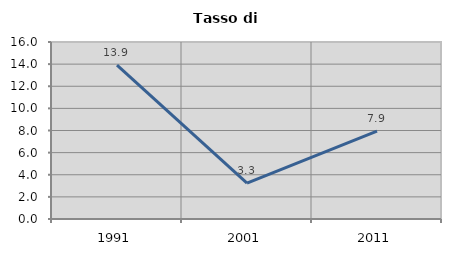
| Category | Tasso di disoccupazione   |
|---|---|
| 1991.0 | 13.913 |
| 2001.0 | 3.252 |
| 2011.0 | 7.947 |